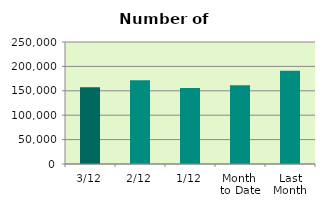
| Category | Series 0 |
|---|---|
| 3/12 | 157462 |
| 2/12 | 171432 |
| 1/12 | 155812 |
| Month 
to Date | 161568.667 |
| Last
Month | 191084.095 |